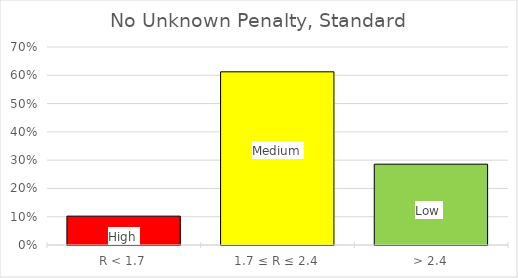
| Category | Frequency |
|---|---|
| R < 1.7 | 0.102 |
| 1.7 ≤ R ≤ 2.4 | 0.612 |
| > 2.4 | 0.286 |